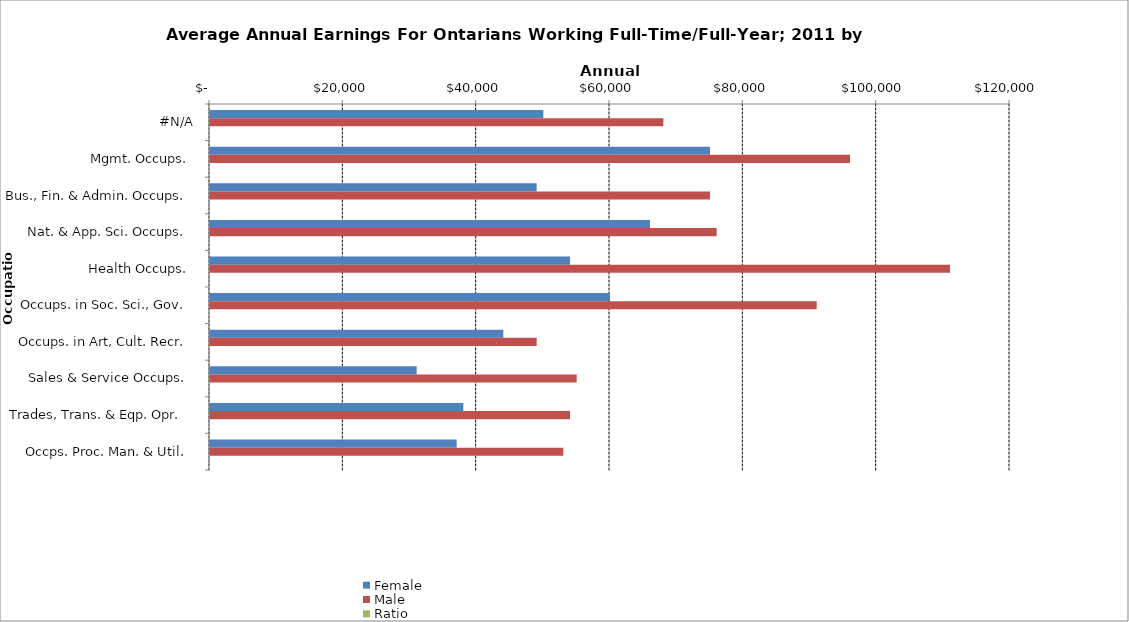
| Category | Female | Male | Ratio |
|---|---|---|---|
|  #N/A  | 50000 | 68000 | 0.735 |
|  Mgmt. Occups.  | 75000 | 96000 | 0.781 |
|  Bus., Fin. & Admin. Occups.  | 49000 | 75000 | 0.653 |
|  Nat. & App. Sci. Occups.  | 66000 | 76000 | 0.868 |
|  Health Occups.  | 54000 | 111000 | 0.486 |
|  Occups. in Soc. Sci., Gov.  | 60000 | 91000 | 0.659 |
|  Occups. in Art, Cult. Recr.  | 44000 | 49000 | 0.898 |
|  Sales & Service Occups.  | 31000 | 55000 | 0.564 |
|  Trades, Trans. & Eqp. Opr.   | 38000 | 54000 | 0.704 |
|  Occps. Proc. Man. & Util.  | 37000 | 53000 | 0.698 |